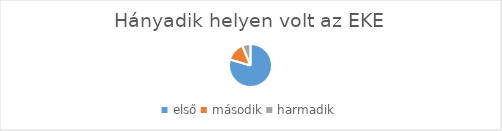
| Category | Series 0 |
|---|---|
| első | 365 |
| második | 65 |
| harmadik | 29 |